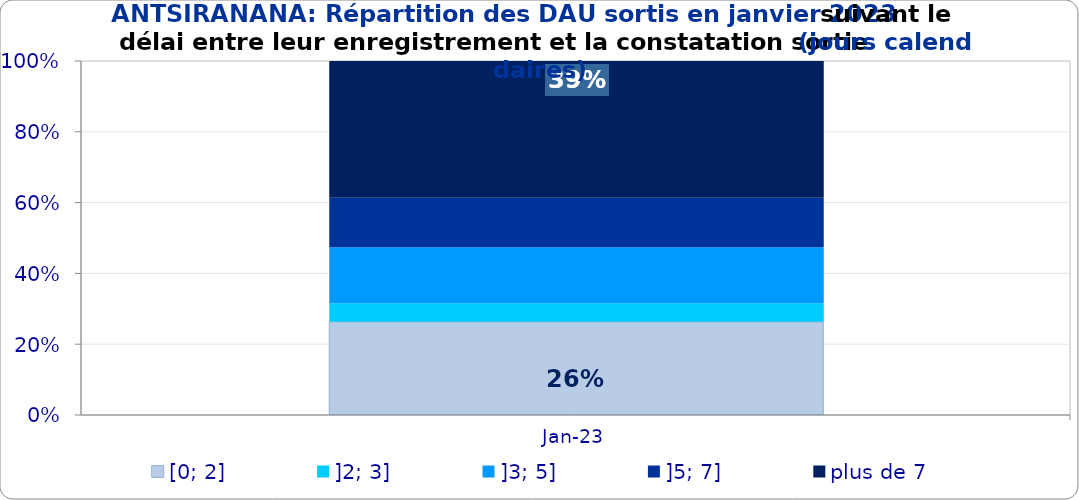
| Category | [0; 2] | ]2; 3] | ]3; 5] | ]5; 7] | plus de 7 |
|---|---|---|---|---|---|
| 2023-01-01 | 0.263 | 0.053 | 0.158 | 0.14 | 0.386 |